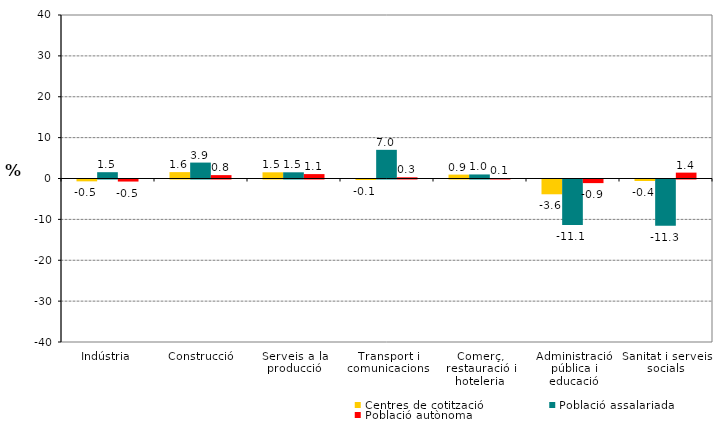
| Category | Centres de cotització | Població assalariada | Població autònoma |
|---|---|---|---|
| Indústria | -0.452 | 1.542 | -0.501 |
| Construcció | 1.564 | 3.895 | 0.827 |
| Serveis a la producció | 1.516 | 1.515 | 1.076 |
| Transport i comunicacions | -0.128 | 7.014 | 0.29 |
| Comerç, restauració i hoteleria | 0.948 | 0.991 | 0.084 |
| Administració pública i educació | -3.616 | -11.119 | -0.885 |
| Sanitat i serveis socials | -0.363 | -11.291 | 1.438 |